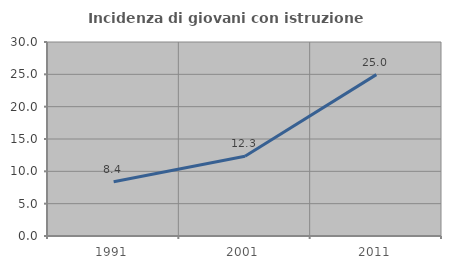
| Category | Incidenza di giovani con istruzione universitaria |
|---|---|
| 1991.0 | 8.377 |
| 2001.0 | 12.344 |
| 2011.0 | 24.956 |